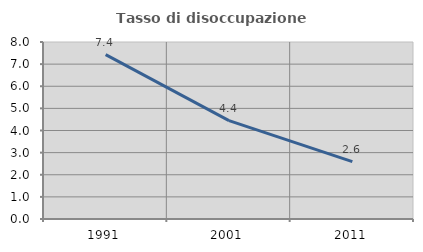
| Category | Tasso di disoccupazione giovanile  |
|---|---|
| 1991.0 | 7.429 |
| 2001.0 | 4.444 |
| 2011.0 | 2.594 |